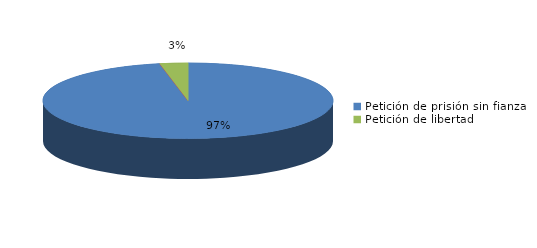
| Category | Series 0 |
|---|---|
| Petición de prisión sin fianza | 155 |
| Peticion de libertad con fianza | 0 |
| Petición de libertad | 5 |